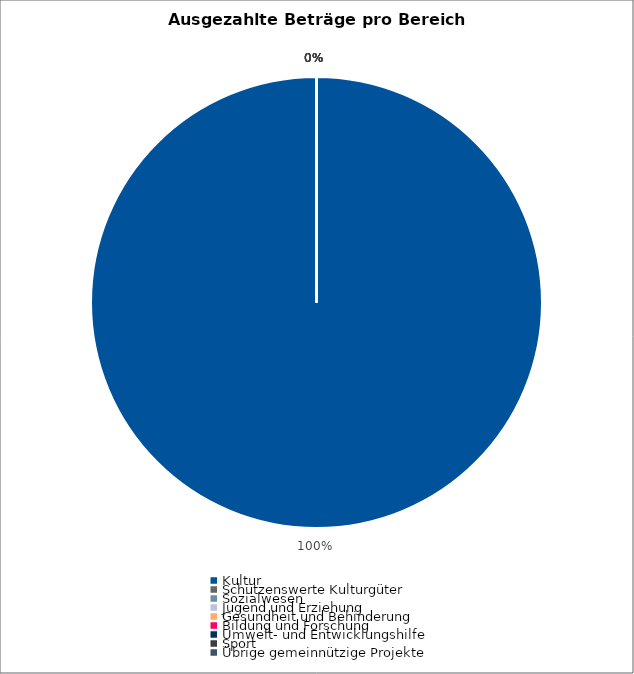
| Category | Series 0 |
|---|---|
| Kultur | 25402060 |
| Schützenswerte Kulturgüter | 0 |
| Sozialwesen | 0 |
| Jugend und Erziehung | 0 |
| Gesundheit und Behinderung | 0 |
| Bildung und Forschung | 0 |
| Umwelt- und Entwicklungshilfe | 0 |
| Sport | 0 |
| Übrige gemeinnützige Projekte | 0 |